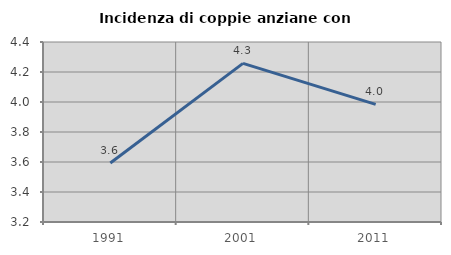
| Category | Incidenza di coppie anziane con figli |
|---|---|
| 1991.0 | 3.594 |
| 2001.0 | 4.258 |
| 2011.0 | 3.984 |